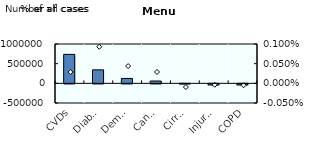
| Category | Number of cases |
|---|---|
| CVDs | 736570.329 |
| Diabetes | 342175.439 |
| Dementia | 124555.801 |
| Cancers | 59492.138 |
| Cirrhosis | -4077.029 |
| Injuries | -27022.915 |
| COPD | -27049.887 |